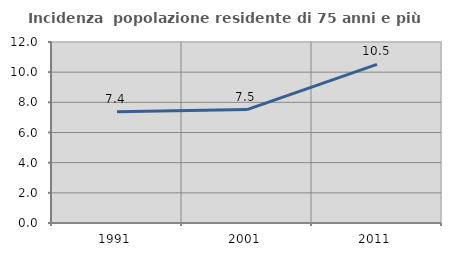
| Category | Incidenza  popolazione residente di 75 anni e più |
|---|---|
| 1991.0 | 7.369 |
| 2001.0 | 7.519 |
| 2011.0 | 10.517 |